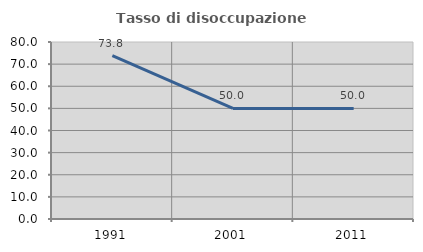
| Category | Tasso di disoccupazione giovanile  |
|---|---|
| 1991.0 | 73.786 |
| 2001.0 | 50 |
| 2011.0 | 50 |